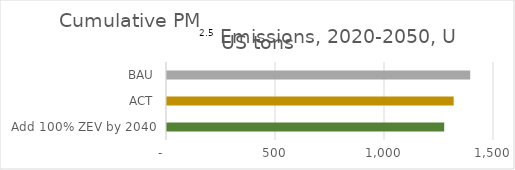
| Category | Cumulative PM2.5 Emissions, 2020-2050, US tons |
|---|---|
| Add 100% ZEV by 2040 | 1271.591 |
| ACT | 1315 |
| BAU | 1391 |